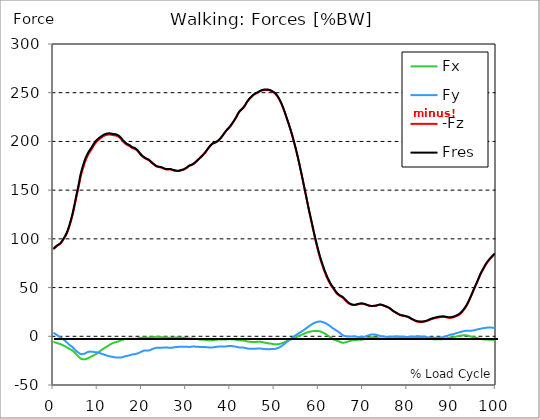
| Category |  Fx |  Fy |  -Fz |  Fres |
|---|---|---|---|---|
| 0.0 | -5.61 | 3.719 | 89.408 | 89.784 |
| 0.167348456675344 | -5.897 | 3.212 | 90.129 | 90.491 |
| 0.334696913350688 | -6.193 | 2.712 | 90.759 | 91.125 |
| 0.5020453700260321 | -6.475 | 2.236 | 91.464 | 91.834 |
| 0.669393826701376 | -6.75 | 1.771 | 92.199 | 92.576 |
| 0.83674228337672 | -7.009 | 1.222 | 92.777 | 93.162 |
| 1.0040907400520642 | -7.251 | 0.63 | 93.339 | 93.739 |
| 1.1621420602454444 | -7.493 | 0.02 | 93.84 | 94.251 |
| 1.3294905169207885 | -7.675 | -0.489 | 94.208 | 94.635 |
| 1.4968389735961325 | -7.882 | -0.96 | 94.776 | 95.227 |
| 1.6641874302714765 | -8.118 | -1.481 | 95.471 | 95.949 |
| 1.8315358869468206 | -8.417 | -1.989 | 96.318 | 96.822 |
| 1.9988843436221646 | -8.773 | -2.401 | 97.482 | 98.018 |
| 2.1662328002975086 | -9.202 | -2.893 | 98.661 | 99.232 |
| 2.333581256972853 | -9.62 | -3.443 | 99.845 | 100.455 |
| 2.5009297136481967 | -10.006 | -4.054 | 101.052 | 101.707 |
| 2.6682781703235405 | -10.366 | -4.699 | 102.289 | 102.989 |
| 2.8356266269988843 | -10.752 | -5.386 | 103.685 | 104.448 |
| 3.002975083674229 | -11.146 | -6.084 | 105.162 | 105.992 |
| 3.1703235403495724 | -11.566 | -6.773 | 106.967 | 107.867 |
| 3.337671997024917 | -12.073 | -7.536 | 109.088 | 110.066 |
| 3.4957233172182973 | -12.632 | -8.419 | 111.205 | 112.278 |
| 3.663071773893641 | -13.054 | -8.988 | 113.649 | 114.788 |
| 3.8304202305689854 | -13.39 | -9.449 | 116.161 | 117.354 |
| 3.997768687244329 | -13.738 | -9.92 | 118.751 | 120 |
| 4.165117143919673 | -14.103 | -10.398 | 121.457 | 122.764 |
| 4.332465600595017 | -14.606 | -11.076 | 124.498 | 125.89 |
| 4.499814057270361 | -15.216 | -11.886 | 127.771 | 129.271 |
| 4.667162513945706 | -15.987 | -12.746 | 131.222 | 132.857 |
| 4.834510970621049 | -16.733 | -13.531 | 134.711 | 136.47 |
| 5.001859427296393 | -17.552 | -14.274 | 138.364 | 140.254 |
| 5.169207883971737 | -18.442 | -15.075 | 142.031 | 144.066 |
| 5.336556340647081 | -19.185 | -15.682 | 145.491 | 147.634 |
| 5.503904797322425 | -19.92 | -16.221 | 148.957 | 151.205 |
| 5.671253253997769 | -20.63 | -16.726 | 152.411 | 154.756 |
| 5.82930457419115 | -21.372 | -17.279 | 156.009 | 158.457 |
| 5.996653030866494 | -22.228 | -17.885 | 160.108 | 162.668 |
| 6.164001487541838 | -22.908 | -18.315 | 163.777 | 166.422 |
| 6.331349944217181 | -23.239 | -18.369 | 166.775 | 169.428 |
| 6.498698400892526 | -23.491 | -18.324 | 169.503 | 172.147 |
| 6.66604685756787 | -23.609 | -18.164 | 171.986 | 174.602 |
| 6.833395314243213 | -23.661 | -18.017 | 174.479 | 177.052 |
| 7.000743770918558 | -23.727 | -17.89 | 177.019 | 179.553 |
| 7.168092227593902 | -23.653 | -17.633 | 179.202 | 181.671 |
| 7.335440684269246 | -23.433 | -17.251 | 181.055 | 183.434 |
| 7.50278914094459 | -23.11 | -16.75 | 182.828 | 185.097 |
| 7.6701375976199335 | -22.797 | -16.3 | 184.561 | 186.728 |
| 7.837486054295278 | -22.514 | -16.014 | 186.159 | 188.252 |
| 7.995537374488658 | -22.155 | -15.849 | 187.582 | 189.607 |
| 8.162885831164003 | -21.746 | -15.778 | 188.817 | 190.781 |
| 8.330234287839346 | -21.348 | -15.71 | 189.867 | 191.775 |
| 8.49758274451469 | -20.975 | -15.715 | 190.959 | 192.821 |
| 8.664931201190035 | -20.616 | -15.786 | 192.17 | 193.991 |
| 8.832279657865378 | -20.231 | -15.816 | 193.493 | 195.262 |
| 8.999628114540721 | -19.866 | -15.956 | 194.808 | 196.54 |
| 9.166976571216066 | -19.496 | -16.111 | 196.057 | 197.754 |
| 9.334325027891412 | -19.092 | -16.214 | 197.211 | 198.868 |
| 9.501673484566755 | -18.647 | -16.275 | 198.26 | 199.871 |
| 9.669021941242098 | -18.174 | -16.386 | 199.245 | 200.814 |
| 9.836370397917442 | -17.62 | -16.496 | 200.076 | 201.6 |
| 10.003718854592787 | -17.042 | -16.624 | 200.807 | 202.29 |
| 10.17106731126813 | -16.458 | -16.771 | 201.461 | 202.907 |
| 10.329118631461512 | -15.88 | -16.942 | 202.097 | 203.508 |
| 10.496467088136853 | -15.312 | -17.143 | 202.724 | 204.103 |
| 10.663815544812199 | -14.777 | -17.432 | 203.321 | 204.68 |
| 10.831164001487544 | -14.256 | -17.764 | 203.885 | 205.231 |
| 10.998512458162887 | -13.729 | -18.066 | 204.414 | 205.745 |
| 11.16586091483823 | -13.201 | -18.341 | 204.919 | 206.235 |
| 11.333209371513574 | -12.671 | -18.594 | 205.42 | 206.72 |
| 11.50055782818892 | -12.17 | -18.799 | 205.818 | 207.103 |
| 11.667906284864264 | -11.707 | -19.044 | 206.156 | 207.433 |
| 11.835254741539607 | -11.26 | -19.329 | 206.486 | 207.76 |
| 12.00260319821495 | -10.817 | -19.638 | 206.697 | 207.975 |
| 12.169951654890292 | -10.334 | -19.908 | 206.84 | 208.117 |
| 12.337300111565641 | -9.856 | -20.157 | 206.949 | 208.224 |
| 12.504648568240984 | -9.357 | -20.378 | 207.02 | 208.29 |
| 12.662699888434362 | -8.861 | -20.574 | 207.051 | 208.312 |
| 12.830048345109708 | -8.411 | -20.716 | 207.022 | 208.276 |
| 12.997396801785053 | -7.99 | -20.805 | 206.926 | 208.17 |
| 13.164745258460396 | -7.574 | -20.962 | 206.76 | 208.003 |
| 13.33209371513574 | -7.182 | -21.031 | 206.579 | 207.814 |
| 13.499442171811083 | -6.829 | -21.19 | 206.418 | 207.656 |
| 13.666790628486426 | -6.581 | -21.397 | 206.311 | 207.562 |
| 13.834139085161771 | -6.377 | -21.603 | 206.267 | 207.531 |
| 14.001487541837117 | -6.189 | -21.68 | 206.139 | 207.407 |
| 14.16883599851246 | -5.99 | -21.75 | 205.984 | 207.254 |
| 14.336184455187803 | -5.74 | -21.826 | 205.742 | 207.014 |
| 14.503532911863147 | -5.531 | -21.773 | 205.422 | 206.683 |
| 14.670881368538492 | -5.33 | -21.826 | 205.026 | 206.29 |
| 14.828932688731873 | -4.947 | -21.848 | 204.446 | 205.702 |
| 14.996281145407215 | -4.542 | -21.862 | 203.833 | 205.082 |
| 15.163629602082558 | -4.319 | -21.811 | 203.083 | 204.326 |
| 15.330978058757903 | -4.096 | -21.759 | 202.332 | 203.569 |
| 15.498326515433247 | -3.795 | -21.59 | 201.376 | 202.594 |
| 15.665674972108594 | -3.509 | -21.402 | 200.434 | 201.631 |
| 15.833023428783937 | -3.27 | -21.138 | 199.607 | 200.775 |
| 16.00037188545928 | -3.052 | -20.833 | 198.856 | 199.993 |
| 16.167720342134626 | -2.793 | -20.609 | 198.141 | 199.253 |
| 16.335068798809967 | -2.626 | -20.417 | 197.485 | 198.579 |
| 16.502417255485312 | -2.575 | -20.25 | 196.878 | 197.957 |
| 16.669765712160658 | -2.576 | -20.114 | 196.392 | 197.46 |
| 16.837114168836 | -2.568 | -19.914 | 196.027 | 197.079 |
| 17.004462625511344 | -2.59 | -19.712 | 195.73 | 196.766 |
| 17.16251394570472 | -2.609 | -19.52 | 195.395 | 196.415 |
| 17.32986240238007 | -2.598 | -19.339 | 194.89 | 195.893 |
| 17.497210859055414 | -2.574 | -19.096 | 194.276 | 195.259 |
| 17.664559315730756 | -2.468 | -18.883 | 193.64 | 194.604 |
| 17.8319077724061 | -2.408 | -18.724 | 193.229 | 194.178 |
| 17.999256229081443 | -2.467 | -18.562 | 192.915 | 193.85 |
| 18.166604685756788 | -2.54 | -18.508 | 192.699 | 193.632 |
| 18.333953142432133 | -2.614 | -18.507 | 192.547 | 193.483 |
| 18.501301599107478 | -2.569 | -18.3 | 192.086 | 193.005 |
| 18.668650055782823 | -2.499 | -18.081 | 191.596 | 192.496 |
| 18.835998512458165 | -2.361 | -17.902 | 191.082 | 191.965 |
| 19.00334696913351 | -2.28 | -17.658 | 190.336 | 191.2 |
| 19.170695425808855 | -2.164 | -17.381 | 189.454 | 190.295 |
| 19.338043882484197 | -2.032 | -17.063 | 188.529 | 189.344 |
| 19.496095202677576 | -1.82 | -16.646 | 187.55 | 188.328 |
| 19.66344365935292 | -1.643 | -16.272 | 186.644 | 187.39 |
| 19.830792116028263 | -1.529 | -15.941 | 185.823 | 186.542 |
| 19.998140572703612 | -1.45 | -15.635 | 185.106 | 185.799 |
| 20.165489029378953 | -1.351 | -15.31 | 184.429 | 185.095 |
| 20.3328374860543 | -1.275 | -15.001 | 183.815 | 184.456 |
| 20.500185942729644 | -1.193 | -14.758 | 183.295 | 183.918 |
| 20.667534399404985 | -1.129 | -14.61 | 182.8 | 183.41 |
| 20.83488285608033 | -1.089 | -14.597 | 182.327 | 182.936 |
| 21.002231312755672 | -1.173 | -14.623 | 181.967 | 182.579 |
| 21.16957976943102 | -1.279 | -14.675 | 181.627 | 182.247 |
| 21.336928226106362 | -1.386 | -14.745 | 181.303 | 181.929 |
| 21.504276682781704 | -1.436 | -14.698 | 180.898 | 181.522 |
| 21.67162513945705 | -1.433 | -14.561 | 180.399 | 181.012 |
| 21.82967645965043 | -1.358 | -14.328 | 179.769 | 180.366 |
| 21.997024916325774 | -1.242 | -13.989 | 179.051 | 179.622 |
| 22.16437337300112 | -1.055 | -13.514 | 178.282 | 178.817 |
| 22.33172182967646 | -0.921 | -13.096 | 177.588 | 178.09 |
| 22.499070286351806 | -0.916 | -12.823 | 177.071 | 177.555 |
| 22.666418743027148 | -0.852 | -12.619 | 176.531 | 177.002 |
| 22.833767199702496 | -0.751 | -12.405 | 175.949 | 176.406 |
| 23.00111565637784 | -0.625 | -12.168 | 175.318 | 175.761 |
| 23.168464113053183 | -0.551 | -11.918 | 174.68 | 175.11 |
| 23.335812569728528 | -0.553 | -11.82 | 174.284 | 174.708 |
| 23.50316102640387 | -0.592 | -11.767 | 173.995 | 174.417 |
| 23.670509483079215 | -0.666 | -11.762 | 173.824 | 174.246 |
| 23.83785793975456 | -0.755 | -11.776 | 173.678 | 174.102 |
| 23.995909259947936 | -0.872 | -11.793 | 173.552 | 173.978 |
| 24.163257716623285 | -0.971 | -11.811 | 173.41 | 173.839 |
| 24.330606173298627 | -1.053 | -11.829 | 173.282 | 173.711 |
| 24.49795462997397 | -1.062 | -11.785 | 173.014 | 173.441 |
| 24.665303086649313 | -1.06 | -11.704 | 172.681 | 173.103 |
| 24.83265154332466 | -1.066 | -11.634 | 172.386 | 172.804 |
| 25.0 | -1.024 | -11.507 | 171.993 | 172.402 |
| 25.167348456675345 | -1.032 | -11.426 | 171.705 | 172.11 |
| 25.334696913350694 | -1.07 | -11.395 | 171.481 | 171.884 |
| 25.502045370026035 | -1.111 | -11.381 | 171.273 | 171.675 |
| 25.669393826701377 | -1.194 | -11.419 | 171.206 | 171.612 |
| 25.836742283376722 | -1.305 | -11.519 | 171.211 | 171.625 |
| 26.004090740052067 | -1.436 | -11.66 | 171.27 | 171.694 |
| 26.17143919672741 | -1.571 | -11.814 | 171.349 | 171.784 |
| 26.329490516920792 | -1.662 | -11.893 | 171.349 | 171.791 |
| 26.49683897359613 | -1.672 | -11.859 | 171.209 | 171.649 |
| 26.66418743027148 | -1.646 | -11.784 | 171.001 | 171.434 |
| 26.831535886946828 | -1.595 | -11.697 | 170.775 | 171.203 |
| 26.998884343622166 | -1.506 | -11.573 | 170.519 | 170.938 |
| 27.166232800297514 | -1.438 | -11.418 | 170.265 | 170.673 |
| 27.333581256972852 | -1.421 | -11.307 | 170.055 | 170.458 |
| 27.5009297136482 | -1.384 | -11.199 | 169.867 | 170.264 |
| 27.668278170323543 | -1.35 | -11.08 | 169.757 | 170.147 |
| 27.835626626998888 | -1.365 | -11.041 | 169.708 | 170.096 |
| 28.002975083674233 | -1.323 | -10.95 | 169.59 | 169.972 |
| 28.170323540349575 | -1.293 | -10.877 | 169.529 | 169.906 |
| 28.33767199702492 | -1.296 | -10.829 | 169.59 | 169.964 |
| 28.50502045370026 | -1.311 | -10.777 | 169.736 | 170.106 |
| 28.663071773893645 | -1.367 | -10.816 | 169.995 | 170.367 |
| 28.830420230568986 | -1.423 | -10.854 | 170.252 | 170.626 |
| 28.99776868724433 | -1.441 | -10.803 | 170.438 | 170.808 |
| 29.165117143919673 | -1.445 | -10.72 | 170.61 | 170.975 |
| 29.33246560059502 | -1.44 | -10.604 | 170.785 | 171.144 |
| 29.499814057270367 | -1.561 | -10.647 | 171.144 | 171.505 |
| 29.66716251394571 | -1.634 | -10.653 | 171.538 | 171.899 |
| 29.834510970621054 | -1.719 | -10.664 | 171.956 | 172.318 |
| 30.00185942729639 | -1.832 | -10.688 | 172.442 | 172.804 |
| 30.169207883971744 | -1.927 | -10.707 | 172.889 | 173.252 |
| 30.33655634064708 | -2.059 | -10.778 | 173.456 | 173.825 |
| 30.50390479732243 | -2.219 | -10.871 | 174.107 | 174.484 |
| 30.671253253997772 | -2.36 | -10.94 | 174.735 | 175.119 |
| 30.829304574191156 | -2.441 | -10.95 | 175.142 | 175.527 |
| 30.996653030866494 | -2.409 | -10.834 | 175.364 | 175.742 |
| 31.164001487541842 | -2.353 | -10.702 | 175.544 | 175.91 |
| 31.331349944217187 | -2.339 | -10.616 | 175.854 | 176.216 |
| 31.498698400892525 | -2.396 | -10.589 | 176.285 | 176.645 |
| 31.666046857567874 | -2.443 | -10.603 | 176.766 | 177.126 |
| 31.833395314243212 | -2.498 | -10.596 | 177.341 | 177.702 |
| 32.00074377091856 | -2.574 | -10.599 | 177.97 | 178.332 |
| 32.1680922275939 | -2.651 | -10.641 | 178.626 | 178.992 |
| 32.33544068426925 | -2.729 | -10.683 | 179.276 | 179.645 |
| 32.50278914094459 | -2.825 | -10.722 | 179.99 | 180.36 |
| 32.670137597619934 | -2.959 | -10.785 | 180.75 | 181.127 |
| 32.83748605429528 | -3.097 | -10.848 | 181.512 | 181.895 |
| 33.004834510970625 | -3.228 | -10.896 | 182.227 | 182.615 |
| 33.162885831164004 | -3.343 | -10.927 | 182.959 | 183.35 |
| 33.33023428783935 | -3.423 | -10.952 | 183.629 | 184.022 |
| 33.497582744514695 | -3.48 | -10.975 | 184.266 | 184.66 |
| 33.664931201190036 | -3.504 | -10.968 | 185.019 | 185.412 |
| 33.83227965786538 | -3.526 | -10.956 | 185.836 | 186.228 |
| 33.99962811454073 | -3.564 | -10.967 | 186.695 | 187.088 |
| 34.16697657121607 | -3.618 | -10.994 | 187.589 | 187.982 |
| 34.33432502789141 | -3.688 | -11.012 | 188.483 | 188.878 |
| 34.50167348456676 | -3.75 | -11.071 | 189.421 | 189.818 |
| 34.6690219412421 | -3.84 | -11.19 | 190.518 | 190.92 |
| 34.83637039791744 | -3.934 | -11.31 | 191.669 | 192.075 |
| 35.00371885459279 | -3.991 | -11.375 | 192.658 | 193.066 |
| 35.17106731126814 | -4.037 | -11.429 | 193.566 | 193.974 |
| 35.338415767943474 | -4.064 | -11.454 | 194.515 | 194.924 |
| 35.49646708813686 | -4.096 | -11.454 | 195.44 | 195.847 |
| 35.6638155448122 | -4.103 | -11.439 | 196.261 | 196.665 |
| 35.831164001487544 | -4.094 | -11.421 | 196.965 | 197.366 |
| 35.998512458162885 | -4.061 | -11.412 | 197.615 | 198.011 |
| 36.165860914838234 | -3.949 | -11.298 | 198.052 | 198.44 |
| 36.333209371513576 | -3.809 | -11.168 | 198.342 | 198.718 |
| 36.50055782818892 | -3.667 | -11.064 | 198.52 | 198.888 |
| 36.667906284864266 | -3.595 | -11.005 | 198.87 | 199.232 |
| 36.83525474153961 | -3.517 | -10.904 | 199.224 | 199.58 |
| 37.002603198214956 | -3.444 | -10.768 | 199.656 | 200.004 |
| 37.1699516548903 | -3.399 | -10.661 | 200.266 | 200.608 |
| 37.337300111565646 | -3.394 | -10.586 | 200.847 | 201.184 |
| 37.50464856824098 | -3.339 | -10.506 | 201.542 | 201.872 |
| 37.66269988843437 | -3.282 | -10.449 | 202.326 | 202.652 |
| 37.83004834510971 | -3.246 | -10.433 | 203.243 | 203.566 |
| 37.99739680178505 | -3.229 | -10.4 | 204.173 | 204.494 |
| 38.16474525846039 | -3.219 | -10.382 | 205.146 | 205.467 |
| 38.33209371513574 | -3.253 | -10.402 | 206.219 | 206.541 |
| 38.49944217181109 | -3.299 | -10.422 | 207.293 | 207.615 |
| 38.666790628486424 | -3.308 | -10.418 | 208.311 | 208.631 |
| 38.83413908516178 | -3.31 | -10.415 | 209.329 | 209.646 |
| 39.001487541837115 | -3.3 | -10.392 | 210.359 | 210.673 |
| 39.16883599851246 | -3.262 | -10.34 | 211.36 | 211.669 |
| 39.336184455187805 | -3.134 | -10.231 | 212.185 | 212.49 |
| 39.503532911863154 | -2.995 | -10.088 | 212.92 | 213.216 |
| 39.670881368538495 | -2.87 | -9.939 | 213.651 | 213.938 |
| 39.83822982521384 | -2.852 | -9.893 | 214.503 | 214.784 |
| 39.996281145407224 | -2.892 | -9.906 | 215.427 | 215.706 |
| 40.163629602082565 | -2.979 | -9.996 | 216.479 | 216.762 |
| 40.33097805875791 | -3.055 | -10.049 | 217.544 | 217.828 |
| 40.498326515433256 | -3.162 | -10.169 | 218.69 | 218.978 |
| 40.6656749721086 | -3.253 | -10.284 | 219.84 | 220.133 |
| 40.83302342878393 | -3.344 | -10.39 | 220.994 | 221.293 |
| 41.00037188545929 | -3.4 | -10.438 | 222.116 | 222.416 |
| 41.16772034213463 | -3.518 | -10.59 | 223.341 | 223.649 |
| 41.33506879880997 | -3.651 | -10.766 | 224.673 | 224.989 |
| 41.50241725548531 | -3.77 | -10.956 | 226.129 | 226.454 |
| 41.66976571216066 | -3.889 | -11.15 | 227.593 | 227.926 |
| 41.837114168836 | -3.985 | -11.297 | 228.877 | 229.218 |
| 42.004462625511344 | -4.071 | -11.418 | 230.045 | 230.391 |
| 42.17181108218669 | -4.173 | -11.528 | 230.931 | 231.281 |
| 42.32986240238007 | -4.241 | -11.58 | 231.745 | 232.097 |
| 42.497210859055414 | -4.236 | -11.561 | 232.433 | 232.784 |
| 42.66455931573076 | -4.217 | -11.528 | 233.077 | 233.425 |
| 42.831907772406105 | -4.22 | -11.497 | 233.722 | 234.069 |
| 42.999256229081446 | -4.374 | -11.649 | 234.697 | 235.052 |
| 43.16660468575679 | -4.526 | -11.799 | 235.727 | 236.092 |
| 43.33395314243214 | -4.684 | -11.95 | 236.861 | 237.235 |
| 43.50130159910748 | -4.867 | -12.146 | 238.126 | 238.512 |
| 43.66865005578282 | -5.056 | -12.348 | 239.486 | 239.885 |
| 43.83599851245817 | -5.223 | -12.491 | 240.614 | 241.022 |
| 44.00334696913351 | -5.392 | -12.596 | 241.659 | 242.076 |
| 44.17069542580886 | -5.554 | -12.701 | 242.672 | 243.097 |
| 44.3380438824842 | -5.656 | -12.791 | 243.596 | 244.026 |
| 44.49609520267758 | -5.699 | -12.822 | 244.404 | 244.835 |
| 44.66344365935292 | -5.725 | -12.811 | 245.143 | 245.573 |
| 44.83079211602827 | -5.765 | -12.795 | 245.87 | 246.298 |
| 44.99814057270361 | -5.821 | -12.802 | 246.601 | 247.031 |
| 45.16548902937895 | -5.903 | -12.857 | 247.283 | 247.719 |
| 45.332837486054295 | -5.975 | -12.905 | 247.912 | 248.352 |
| 45.500185942729644 | -5.977 | -12.883 | 248.423 | 248.861 |
| 45.66753439940499 | -5.915 | -12.803 | 248.872 | 249.305 |
| 45.83488285608033 | -5.825 | -12.71 | 249.304 | 249.73 |
| 46.00223131275568 | -5.714 | -12.621 | 249.65 | 250.067 |
| 46.16957976943102 | -5.554 | -12.491 | 249.889 | 250.295 |
| 46.336928226106366 | -5.492 | -12.458 | 250.282 | 250.683 |
| 46.50427668278171 | -5.46 | -12.443 | 250.798 | 251.196 |
| 46.671625139457056 | -5.541 | -12.49 | 251.307 | 251.71 |
| 46.829676459650436 | -5.691 | -12.611 | 251.719 | 252.132 |
| 46.99702491632577 | -5.762 | -12.672 | 252.024 | 252.441 |
| 47.16437337300112 | -5.85 | -12.718 | 252.279 | 252.698 |
| 47.33172182967646 | -6.028 | -12.814 | 252.491 | 252.917 |
| 47.49907028635181 | -6.248 | -12.958 | 252.66 | 253.096 |
| 47.66641874302716 | -6.456 | -13.084 | 252.77 | 253.214 |
| 47.83376719970249 | -6.652 | -13.196 | 252.873 | 253.324 |
| 48.001115656377834 | -6.773 | -13.212 | 252.926 | 253.381 |
| 48.16846411305319 | -6.842 | -13.154 | 252.893 | 253.348 |
| 48.33581256972853 | -6.974 | -13.152 | 252.833 | 253.291 |
| 48.50316102640387 | -7.16 | -13.207 | 252.856 | 253.319 |
| 48.67050948307921 | -7.267 | -13.212 | 252.68 | 253.146 |
| 48.837857939754564 | -7.365 | -13.204 | 252.462 | 252.93 |
| 49.005206396429905 | -7.464 | -13.195 | 252.245 | 252.714 |
| 49.163257716623285 | -7.583 | -13.201 | 251.973 | 252.446 |
| 49.33060617329863 | -7.655 | -13.117 | 251.54 | 252.01 |
| 49.49795462997397 | -7.738 | -13.007 | 251.01 | 251.479 |
| 49.66530308664932 | -7.889 | -12.976 | 250.569 | 251.041 |
| 49.832651543324666 | -8.079 | -13.008 | 250.207 | 250.686 |
| 50.0 | -8.193 | -12.97 | 249.672 | 250.154 |
| 50.16734845667534 | -8.272 | -12.886 | 249.002 | 249.483 |
| 50.33469691335069 | -8.312 | -12.739 | 248.196 | 248.672 |
| 50.50204537002604 | -8.319 | -12.551 | 247.289 | 247.758 |
| 50.66939382670139 | -8.272 | -12.316 | 246.255 | 246.715 |
| 50.836742283376715 | -8.181 | -12.022 | 245.154 | 245.6 |
| 51.00409074005207 | -8.03 | -11.638 | 243.796 | 244.222 |
| 51.17143919672741 | -7.826 | -11.2 | 242.367 | 242.771 |
| 51.32949051692079 | -7.617 | -10.758 | 240.885 | 241.267 |
| 51.496838973596134 | -7.436 | -10.344 | 239.339 | 239.699 |
| 51.66418743027148 | -7.202 | -9.844 | 237.605 | 237.943 |
| 51.831535886946824 | -6.874 | -9.224 | 235.716 | 236.023 |
| 51.99888434362217 | -6.583 | -8.662 | 233.778 | 234.06 |
| 52.16623280029752 | -6.233 | -8.047 | 231.772 | 232.025 |
| 52.33358125697285 | -5.884 | -7.427 | 229.671 | 229.897 |
| 52.5009297136482 | -5.544 | -6.818 | 227.445 | 227.645 |
| 52.668278170323546 | -5.196 | -6.192 | 225.215 | 225.39 |
| 52.835626626998895 | -4.846 | -5.568 | 222.981 | 223.131 |
| 53.00297508367424 | -4.5 | -4.935 | 220.754 | 220.882 |
| 53.17032354034958 | -4.177 | -4.348 | 218.504 | 218.612 |
| 53.33767199702492 | -3.868 | -3.754 | 216.199 | 216.294 |
| 53.50502045370027 | -3.514 | -3.128 | 213.835 | 213.916 |
| 53.663071773893655 | -3.198 | -2.57 | 211.342 | 211.416 |
| 53.83042023056899 | -2.896 | -2.023 | 208.838 | 208.903 |
| 53.99776868724433 | -2.61 | -1.484 | 206.306 | 206.365 |
| 54.16511714391967 | -2.282 | -0.926 | 203.638 | 203.69 |
| 54.33246560059503 | -1.952 | -0.357 | 200.833 | 200.881 |
| 54.49981405727037 | -1.642 | 0.181 | 197.99 | 198.034 |
| 54.667162513945705 | -1.332 | 0.694 | 195.055 | 195.098 |
| 54.834510970621054 | -1.014 | 1.2 | 192.042 | 192.085 |
| 55.0018594272964 | -0.689 | 1.707 | 188.971 | 189.017 |
| 55.169207883971744 | -0.37 | 2.193 | 185.836 | 185.886 |
| 55.336556340647086 | -0.042 | 2.647 | 182.582 | 182.64 |
| 55.50390479732243 | 0.284 | 3.132 | 179.232 | 179.298 |
| 55.671253253997776 | 0.632 | 3.607 | 175.804 | 175.879 |
| 55.83860171067312 | 0.969 | 4.07 | 172.302 | 172.391 |
| 55.9966530308665 | 1.3 | 4.536 | 168.804 | 168.909 |
| 56.16400148754184 | 1.638 | 5.03 | 165.236 | 165.36 |
| 56.33134994421718 | 1.977 | 5.53 | 161.607 | 161.753 |
| 56.498698400892536 | 2.31 | 6.042 | 157.926 | 158.098 |
| 56.66604685756788 | 2.643 | 6.571 | 154.214 | 154.42 |
| 56.83339531424321 | 2.985 | 7.12 | 150.522 | 150.761 |
| 57.00074377091856 | 3.31 | 7.658 | 146.852 | 147.128 |
| 57.16809222759391 | 3.614 | 8.221 | 143.108 | 143.436 |
| 57.33544068426925 | 3.892 | 8.793 | 139.354 | 139.734 |
| 57.5027891409446 | 4.152 | 9.353 | 135.609 | 136.048 |
| 57.670137597619934 | 4.393 | 9.894 | 131.941 | 132.436 |
| 57.83748605429528 | 4.614 | 10.448 | 128.356 | 128.918 |
| 58.004834510970625 | 4.785 | 10.975 | 124.843 | 125.476 |
| 58.16288583116401 | 4.922 | 11.471 | 121.391 | 122.096 |
| 58.330234287839346 | 5.043 | 11.944 | 117.931 | 118.708 |
| 58.497582744514695 | 5.165 | 12.424 | 114.409 | 115.268 |
| 58.66493120119004 | 5.274 | 12.882 | 110.905 | 111.845 |
| 58.832279657865385 | 5.362 | 13.316 | 107.433 | 108.455 |
| 58.999628114540734 | 5.418 | 13.701 | 104.005 | 105.114 |
| 59.16697657121607 | 5.452 | 14.047 | 100.617 | 101.81 |
| 59.33432502789142 | 5.452 | 14.329 | 97.326 | 98.596 |
| 59.50167348456676 | 5.416 | 14.55 | 94.158 | 95.5 |
| 59.66902194124211 | 5.389 | 14.779 | 91.076 | 92.491 |
| 59.83637039791745 | 5.33 | 14.944 | 88.036 | 89.522 |
| 60.00371885459278 | 5.238 | 15.065 | 85.152 | 86.697 |
| 60.17106731126813 | 5.148 | 15.193 | 82.352 | 83.958 |
| 60.33841576794349 | 5.011 | 15.24 | 79.673 | 81.322 |
| 60.49646708813685 | 4.75 | 15.138 | 77.209 | 78.872 |
| 60.6638155448122 | 4.419 | 14.932 | 74.866 | 76.519 |
| 60.831164001487544 | 4.094 | 14.751 | 72.57 | 74.219 |
| 60.99851245816289 | 3.716 | 14.483 | 70.369 | 71.996 |
| 61.16586091483824 | 3.341 | 14.211 | 68.227 | 69.832 |
| 61.333209371513576 | 2.93 | 13.876 | 66.153 | 67.722 |
| 61.50055782818892 | 2.489 | 13.518 | 64.198 | 65.723 |
| 61.667906284864266 | 1.991 | 13.114 | 62.366 | 63.831 |
| 61.835254741539615 | 1.466 | 12.688 | 60.6 | 62.006 |
| 62.002603198214956 | 0.935 | 12.207 | 58.946 | 60.296 |
| 62.16995165489029 | 0.432 | 11.734 | 57.4 | 58.692 |
| 62.33730011156564 | -0.096 | 11.217 | 55.893 | 57.123 |
| 62.504648568240995 | -0.627 | 10.656 | 54.479 | 55.639 |
| 62.67199702491633 | -1.132 | 10.136 | 53.099 | 54.201 |
| 62.83004834510971 | -1.577 | 9.599 | 51.921 | 52.978 |
| 62.99739680178505 | -2.101 | 8.981 | 50.845 | 51.835 |
| 63.1647452584604 | -2.667 | 8.336 | 49.833 | 50.773 |
| 63.33209371513575 | -3.182 | 7.742 | 48.789 | 49.69 |
| 63.4994421718111 | -3.563 | 7.26 | 47.648 | 48.515 |
| 63.666790628486424 | -3.815 | 6.85 | 46.501 | 47.345 |
| 63.83413908516177 | -4.126 | 6.417 | 45.397 | 46.216 |
| 64.00148754183712 | -4.314 | 6.001 | 44.381 | 45.172 |
| 64.16883599851248 | -4.538 | 5.53 | 43.526 | 44.278 |
| 64.3361844551878 | -4.866 | 4.982 | 42.828 | 43.547 |
| 64.50353291186315 | -5.171 | 4.422 | 42.214 | 42.917 |
| 64.6708813685385 | -5.429 | 3.885 | 41.653 | 42.351 |
| 64.83822982521384 | -5.748 | 3.312 | 41.164 | 41.856 |
| 65.00557828188919 | -6.068 | 2.678 | 40.709 | 41.405 |
| 65.16362960208257 | -6.389 | 2.01 | 40.339 | 41.025 |
| 65.3309780587579 | -6.657 | 1.366 | 39.962 | 40.636 |
| 65.49832651543326 | -6.691 | 0.91 | 39.368 | 40.048 |
| 65.6656749721086 | -6.612 | 0.564 | 38.675 | 39.35 |
| 65.83302342878395 | -6.45 | 0.343 | 37.89 | 38.545 |
| 66.00037188545929 | -6.259 | 0.149 | 37.093 | 37.731 |
| 66.16772034213463 | -6.057 | -0.038 | 36.298 | 36.916 |
| 66.33506879880998 | -5.824 | -0.154 | 35.57 | 36.151 |
| 66.50241725548531 | -5.549 | -0.18 | 34.874 | 35.411 |
| 66.66976571216065 | -5.303 | -0.217 | 34.241 | 34.739 |
| 66.83711416883601 | -5.085 | -0.253 | 33.686 | 34.147 |
| 67.00446262551135 | -4.914 | -0.305 | 33.258 | 33.687 |
| 67.1718110821867 | -4.74 | -0.334 | 32.885 | 33.285 |
| 67.32986240238007 | -4.439 | -0.16 | 32.513 | 32.868 |
| 67.49721085905541 | -4.241 | -0.114 | 32.32 | 32.648 |
| 67.66455931573076 | -4.086 | -0.107 | 32.167 | 32.475 |
| 67.83190777240611 | -3.952 | -0.095 | 32.073 | 32.366 |
| 67.99925622908145 | -3.857 | -0.141 | 32.014 | 32.291 |
| 68.16660468575678 | -3.791 | -0.221 | 32.001 | 32.268 |
| 68.33395314243214 | -3.761 | -0.352 | 32.151 | 32.419 |
| 68.50130159910749 | -3.728 | -0.468 | 32.367 | 32.632 |
| 68.66865005578282 | -3.698 | -0.55 | 32.604 | 32.869 |
| 68.83599851245816 | -3.667 | -0.657 | 32.865 | 33.127 |
| 69.00334696913352 | -3.646 | -0.744 | 33.053 | 33.315 |
| 69.17069542580886 | -3.609 | -0.794 | 33.185 | 33.448 |
| 69.3380438824842 | -3.536 | -0.762 | 33.317 | 33.573 |
| 69.50539233915956 | -3.522 | -0.817 | 33.473 | 33.73 |
| 69.66344365935292 | -3.476 | -0.847 | 33.565 | 33.819 |
| 69.83079211602826 | -3.351 | -0.827 | 33.501 | 33.743 |
| 69.99814057270362 | -3.192 | -0.726 | 33.392 | 33.615 |
| 70.16548902937896 | -3.022 | -0.585 | 33.241 | 33.447 |
| 70.33283748605429 | -2.827 | -0.419 | 33.056 | 33.244 |
| 70.50018594272964 | -2.609 | -0.225 | 32.852 | 33.021 |
| 70.667534399405 | -2.39 | 0.026 | 32.591 | 32.746 |
| 70.83488285608033 | -2.159 | 0.267 | 32.315 | 32.458 |
| 71.00223131275568 | -1.907 | 0.566 | 31.974 | 32.12 |
| 71.16957976943102 | -1.677 | 0.835 | 31.707 | 31.848 |
| 71.33692822610637 | -1.475 | 1.097 | 31.482 | 31.62 |
| 71.50427668278171 | -1.304 | 1.348 | 31.292 | 31.431 |
| 71.67162513945706 | -1.134 | 1.585 | 31.126 | 31.262 |
| 71.8389735961324 | -1.048 | 1.732 | 31.061 | 31.196 |
| 71.99702491632577 | -0.978 | 1.826 | 31.029 | 31.167 |
| 72.16437337300113 | -0.986 | 1.852 | 31.039 | 31.176 |
| 72.33172182967647 | -1.036 | 1.847 | 31.076 | 31.209 |
| 72.49907028635181 | -1.084 | 1.838 | 31.12 | 31.249 |
| 72.66641874302715 | -1.161 | 1.79 | 31.195 | 31.317 |
| 72.8337671997025 | -1.236 | 1.717 | 31.294 | 31.411 |
| 73.00111565637783 | -1.345 | 1.576 | 31.45 | 31.564 |
| 73.16846411305319 | -1.512 | 1.359 | 31.646 | 31.756 |
| 73.33581256972853 | -1.723 | 1.084 | 31.876 | 31.992 |
| 73.50316102640387 | -1.954 | 0.773 | 32.149 | 32.281 |
| 73.67050948307921 | -2.134 | 0.512 | 32.346 | 32.484 |
| 73.83785793975457 | -2.281 | 0.303 | 32.419 | 32.564 |
| 74.00520639642991 | -2.395 | 0.147 | 32.385 | 32.539 |
| 74.16325771662328 | -2.488 | 0.008 | 32.286 | 32.445 |
| 74.33060617329863 | -2.575 | -0.13 | 32.088 | 32.252 |
| 74.49795462997398 | -2.582 | -0.197 | 31.792 | 31.967 |
| 74.66530308664932 | -2.575 | -0.249 | 31.478 | 31.665 |
| 74.83265154332466 | -2.549 | -0.284 | 31.147 | 31.341 |
| 75.00000000000001 | -2.576 | -0.365 | 30.862 | 31.061 |
| 75.16734845667534 | -2.615 | -0.473 | 30.586 | 30.792 |
| 75.3346969133507 | -2.645 | -0.557 | 30.3 | 30.51 |
| 75.50204537002605 | -2.655 | -0.598 | 29.993 | 30.209 |
| 75.66939382670138 | -2.665 | -0.626 | 29.639 | 29.865 |
| 75.83674228337672 | -2.676 | -0.657 | 29.251 | 29.49 |
| 76.00409074005208 | -2.669 | -0.673 | 28.83 | 29.077 |
| 76.17143919672742 | -2.575 | -0.618 | 28.264 | 28.511 |
| 76.33878765340276 | -2.431 | -0.489 | 27.662 | 27.904 |
| 76.49683897359614 | -2.3 | -0.381 | 27.059 | 27.298 |
| 76.66418743027148 | -2.178 | -0.273 | 26.416 | 26.649 |
| 76.83153588694682 | -2.095 | -0.223 | 25.823 | 26.057 |
| 76.99888434362218 | -2.031 | -0.193 | 25.341 | 25.579 |
| 77.16623280029752 | -2.013 | -0.214 | 24.907 | 25.153 |
| 77.33358125697285 | -1.998 | -0.266 | 24.472 | 24.726 |
| 77.5009297136482 | -1.987 | -0.344 | 24.025 | 24.288 |
| 77.66827817032356 | -1.943 | -0.342 | 23.57 | 23.84 |
| 77.83562662699889 | -1.904 | -0.327 | 23.154 | 23.432 |
| 78.00297508367423 | -1.87 | -0.301 | 22.723 | 23.006 |
| 78.17032354034959 | -1.842 | -0.292 | 22.293 | 22.58 |
| 78.33767199702493 | -1.833 | -0.277 | 21.922 | 22.215 |
| 78.50502045370027 | -1.84 | -0.277 | 21.589 | 21.885 |
| 78.67236891037561 | -1.902 | -0.334 | 21.365 | 21.668 |
| 78.83042023056899 | -2.002 | -0.429 | 21.211 | 21.52 |
| 78.99776868724433 | -2.104 | -0.525 | 21.071 | 21.382 |
| 79.16511714391969 | -2.212 | -0.624 | 20.96 | 21.271 |
| 79.33246560059503 | -2.291 | -0.717 | 20.821 | 21.133 |
| 79.49981405727036 | -2.338 | -0.797 | 20.654 | 20.971 |
| 79.66716251394571 | -2.332 | -0.824 | 20.432 | 20.753 |
| 79.83451097062107 | -2.29 | -0.8 | 20.166 | 20.491 |
| 80.00185942729641 | -2.277 | -0.775 | 20.01 | 20.341 |
| 80.16920788397174 | -2.258 | -0.766 | 19.757 | 20.091 |
| 80.33655634064709 | -2.208 | -0.726 | 19.429 | 19.762 |
| 80.50390479732243 | -2.152 | -0.689 | 19.064 | 19.397 |
| 80.67125325399778 | -2.056 | -0.574 | 18.625 | 18.96 |
| 80.83860171067312 | -1.918 | -0.441 | 18.111 | 18.455 |
| 80.99665303086651 | -1.803 | -0.358 | 17.621 | 17.975 |
| 81.16400148754184 | -1.775 | -0.36 | 17.302 | 17.658 |
| 81.3313499442172 | -1.702 | -0.319 | 16.907 | 17.275 |
| 81.49869840089255 | -1.616 | -0.264 | 16.488 | 16.869 |
| 81.66604685756786 | -1.52 | -0.18 | 16.081 | 16.478 |
| 81.83339531424322 | -1.464 | -0.129 | 15.757 | 16.163 |
| 82.00074377091858 | -1.427 | -0.094 | 15.474 | 15.883 |
| 82.16809222759392 | -1.379 | -0.041 | 15.221 | 15.631 |
| 82.33544068426926 | -1.323 | 0.026 | 14.991 | 15.4 |
| 82.50278914094459 | -1.347 | 0.008 | 14.9 | 15.309 |
| 82.67013759761994 | -1.374 | -0.019 | 14.827 | 15.238 |
| 82.83748605429528 | -1.402 | -0.059 | 14.784 | 15.196 |
| 83.00483451097062 | -1.441 | -0.116 | 14.748 | 15.16 |
| 83.17218296764597 | -1.49 | -0.186 | 14.733 | 15.146 |
| 83.33023428783935 | -1.552 | -0.259 | 14.754 | 15.161 |
| 83.4975827445147 | -1.612 | -0.335 | 14.792 | 15.194 |
| 83.66493120119004 | -1.685 | -0.421 | 14.875 | 15.277 |
| 83.83227965786537 | -1.766 | -0.503 | 15.007 | 15.411 |
| 83.99962811454073 | -1.848 | -0.583 | 15.16 | 15.569 |
| 84.16697657121607 | -1.947 | -0.694 | 15.333 | 15.742 |
| 84.33432502789142 | -2.055 | -0.819 | 15.531 | 15.95 |
| 84.50167348456677 | -2.149 | -0.915 | 15.77 | 16.2 |
| 84.6690219412421 | -2.23 | -0.982 | 16.027 | 16.474 |
| 84.83637039791745 | -2.346 | -1.08 | 16.349 | 16.82 |
| 85.0037188545928 | -2.492 | -1.22 | 16.705 | 17.205 |
| 85.17106731126813 | -2.642 | -1.391 | 17.051 | 17.588 |
| 85.33841576794349 | -2.744 | -1.475 | 17.327 | 17.888 |
| 85.50576422461883 | -2.828 | -1.521 | 17.59 | 18.169 |
| 85.66381554481221 | -2.9 | -1.529 | 17.829 | 18.422 |
| 85.83116400148755 | -2.941 | -1.522 | 18.046 | 18.644 |
| 85.99851245816289 | -2.964 | -1.515 | 18.246 | 18.846 |
| 86.16586091483823 | -2.978 | -1.502 | 18.439 | 19.04 |
| 86.33320937151358 | -3.008 | -1.514 | 18.612 | 19.229 |
| 86.50055782818893 | -3.033 | -1.536 | 18.76 | 19.388 |
| 86.66790628486427 | -3.079 | -1.581 | 18.948 | 19.584 |
| 86.83525474153961 | -3.116 | -1.594 | 19.13 | 19.77 |
| 87.00260319821496 | -3.133 | -1.569 | 19.301 | 19.939 |
| 87.16995165489031 | -3.126 | -1.495 | 19.447 | 20.075 |
| 87.33730011156564 | -3.122 | -1.422 | 19.581 | 20.203 |
| 87.504648568241 | -3.1 | -1.318 | 19.691 | 20.315 |
| 87.67199702491634 | -3.055 | -1.197 | 19.791 | 20.392 |
| 87.83004834510972 | -3.022 | -1.071 | 19.87 | 20.452 |
| 87.99739680178506 | -2.962 | -0.926 | 19.918 | 20.483 |
| 88.1647452584604 | -2.899 | -0.794 | 19.919 | 20.46 |
| 88.33209371513574 | -2.752 | -0.561 | 19.918 | 20.416 |
| 88.49944217181108 | -2.6 | -0.346 | 19.854 | 20.317 |
| 88.66679062848644 | -2.428 | -0.109 | 19.722 | 20.165 |
| 88.83413908516178 | -2.244 | 0.142 | 19.552 | 19.985 |
| 89.00148754183712 | -2.073 | 0.388 | 19.391 | 19.827 |
| 89.16883599851246 | -1.907 | 0.643 | 19.235 | 19.694 |
| 89.33618445518782 | -1.716 | 0.948 | 19.073 | 19.579 |
| 89.50353291186315 | -1.512 | 1.246 | 18.94 | 19.467 |
| 89.6708813685385 | -1.326 | 1.521 | 18.847 | 19.396 |
| 89.83822982521386 | -1.186 | 1.724 | 18.918 | 19.481 |
| 90.00557828188919 | -1.079 | 1.882 | 19.048 | 19.642 |
| 90.16362960208257 | -0.994 | 2.027 | 19.191 | 19.82 |
| 90.3309780587579 | -0.892 | 2.182 | 19.376 | 20.021 |
| 90.49832651543326 | -0.766 | 2.377 | 19.601 | 20.265 |
| 90.66567497210859 | -0.66 | 2.541 | 19.867 | 20.534 |
| 90.83302342878395 | -0.535 | 2.726 | 20.185 | 20.846 |
| 91.00037188545929 | -0.388 | 2.946 | 20.495 | 21.158 |
| 91.16772034213463 | -0.234 | 3.173 | 20.815 | 21.482 |
| 91.33506879880998 | -0.047 | 3.455 | 21.141 | 21.823 |
| 91.50241725548533 | 0.166 | 3.771 | 21.425 | 22.138 |
| 91.66976571216065 | 0.315 | 4.004 | 21.858 | 22.588 |
| 91.83711416883601 | 0.427 | 4.192 | 22.396 | 23.131 |
| 92.00446262551137 | 0.544 | 4.396 | 23.028 | 23.767 |
| 92.1718110821867 | 0.621 | 4.512 | 23.759 | 24.479 |
| 92.33915953886203 | 0.749 | 4.759 | 24.567 | 25.296 |
| 92.49721085905541 | 0.859 | 5.006 | 25.416 | 26.15 |
| 92.66455931573077 | 0.955 | 5.215 | 26.306 | 27.041 |
| 92.83190777240611 | 0.994 | 5.353 | 27.284 | 28.009 |
| 92.99925622908145 | 0.973 | 5.425 | 28.339 | 29.046 |
| 93.1666046857568 | 0.951 | 5.519 | 29.441 | 30.14 |
| 93.33395314243214 | 0.923 | 5.656 | 30.623 | 31.326 |
| 93.50130159910749 | 0.825 | 5.748 | 31.952 | 32.643 |
| 93.66865005578283 | 0.646 | 5.772 | 33.405 | 34.069 |
| 93.83599851245818 | 0.453 | 5.788 | 34.927 | 35.564 |
| 94.00334696913353 | 0.265 | 5.786 | 36.545 | 37.147 |
| 94.17069542580886 | 0.05 | 5.751 | 38.182 | 38.748 |
| 94.3380438824842 | -0.169 | 5.723 | 39.895 | 40.431 |
| 94.50539233915954 | -0.384 | 5.736 | 41.672 | 42.189 |
| 94.66344365935292 | -0.581 | 5.801 | 43.474 | 43.974 |
| 94.83079211602828 | -0.794 | 5.859 | 45.377 | 45.848 |
| 94.99814057270362 | -0.981 | 5.96 | 47.212 | 47.669 |
| 95.16548902937897 | -1.125 | 6.152 | 48.94 | 49.406 |
| 95.33283748605432 | -1.252 | 6.395 | 50.588 | 51.074 |
| 95.50018594272963 | -1.433 | 6.544 | 52.329 | 52.826 |
| 95.66753439940499 | -1.553 | 6.777 | 53.945 | 54.462 |
| 95.83488285608034 | -1.728 | 6.993 | 55.653 | 56.189 |
| 96.00223131275567 | -1.941 | 7.159 | 57.418 | 57.966 |
| 96.16957976943102 | -2.164 | 7.317 | 59.22 | 59.778 |
| 96.33692822610638 | -2.352 | 7.54 | 60.99 | 61.565 |
| 96.50427668278171 | -2.546 | 7.694 | 62.765 | 63.349 |
| 96.67162513945706 | -2.716 | 7.841 | 64.445 | 65.037 |
| 96.8389735961324 | -2.824 | 8.01 | 65.831 | 66.442 |
| 96.99702491632577 | -2.929 | 8.128 | 67.215 | 67.833 |
| 97.16437337300111 | -3.032 | 8.236 | 68.581 | 69.204 |
| 97.33172182967647 | -3.136 | 8.375 | 69.98 | 70.612 |
| 97.49907028635181 | -3.231 | 8.498 | 71.343 | 71.981 |
| 97.66641874302715 | -3.319 | 8.615 | 72.691 | 73.333 |
| 97.8337671997025 | -3.354 | 8.75 | 73.945 | 74.595 |
| 98.00111565637785 | -3.371 | 8.85 | 75.067 | 75.721 |
| 98.16846411305319 | -3.386 | 8.941 | 76.121 | 76.779 |
| 98.33581256972855 | -3.412 | 8.956 | 77.053 | 77.706 |
| 98.50316102640389 | -3.47 | 9.011 | 77.951 | 78.606 |
| 98.67050948307921 | -3.566 | 9.031 | 78.947 | 79.602 |
| 98.83785793975456 | -3.588 | 9.007 | 79.827 | 80.479 |
| 99.0052063964299 | -3.601 | 8.941 | 80.644 | 81.288 |
| 99.17255485310525 | -3.622 | 8.874 | 81.434 | 82.07 |
| 99.33060617329863 | -3.654 | 8.811 | 82.251 | 82.875 |
| 99.49795462997399 | -3.681 | 8.697 | 83.021 | 83.627 |
| 99.66530308664933 | -3.704 | 8.502 | 83.72 | 84.299 |
| 99.83265154332467 | -3.74 | 8.324 | 84.452 | 85.006 |
| 100.0 | -3.798 | 8.179 | 85.252 | 85.789 |